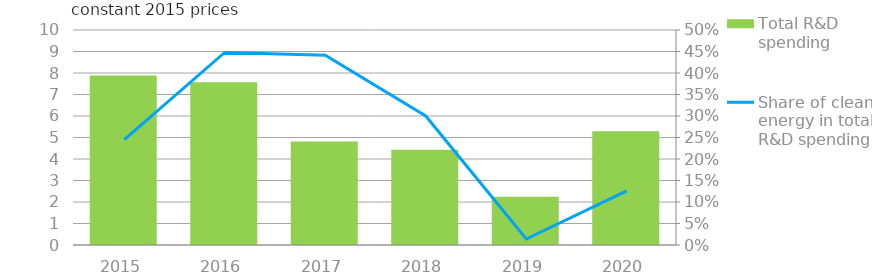
| Category | Total R&D spending |
|---|---|
| 2015.0 | 7.885 |
| 2016.0 | 7.566 |
| 2017.0 | 4.816 |
| 2018.0 | 4.431 |
| 2019.0 | 2.24 |
| 2020.0 | 5.293 |